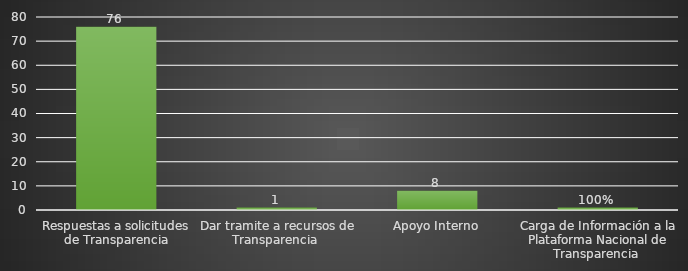
| Category | INDICADOR  |
|---|---|
| Respuestas a solicitudes de Transparencia | 76 |
| Dar tramite a recursos de Transparencia  | 1 |
| Apoyo Interno | 8 |
| Carga de Información a la Plataforma Nacional de Transparencia  | 1 |